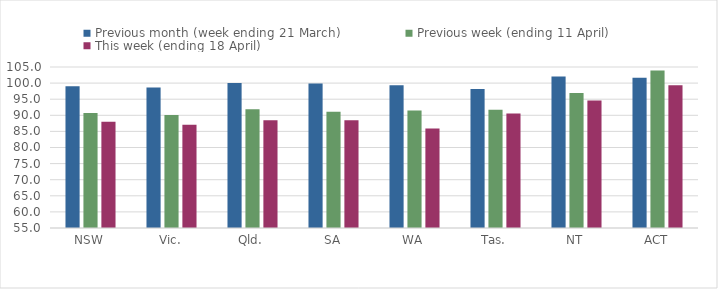
| Category | Previous month (week ending 21 March) | Previous week (ending 11 April) | This week (ending 18 April) |
|---|---|---|---|
| NSW | 99.029 | 90.73 | 87.972 |
| Vic. | 98.64 | 90.102 | 87.087 |
| Qld. | 100.056 | 91.888 | 88.439 |
| SA | 99.845 | 91.105 | 88.483 |
| WA | 99.317 | 91.467 | 85.899 |
| Tas. | 98.133 | 91.758 | 90.534 |
| NT | 102.033 | 96.89 | 94.61 |
| ACT | 101.669 | 103.945 | 99.357 |